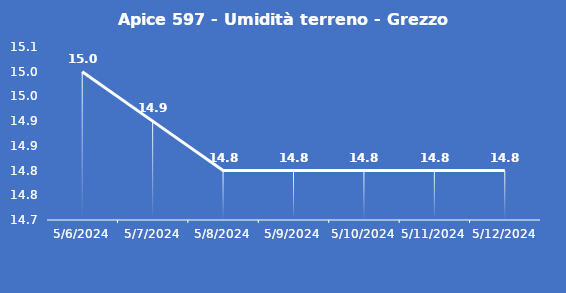
| Category | Apice 597 - Umidità terreno - Grezzo (%VWC) |
|---|---|
| 5/6/24 | 15 |
| 5/7/24 | 14.9 |
| 5/8/24 | 14.8 |
| 5/9/24 | 14.8 |
| 5/10/24 | 14.8 |
| 5/11/24 | 14.8 |
| 5/12/24 | 14.8 |